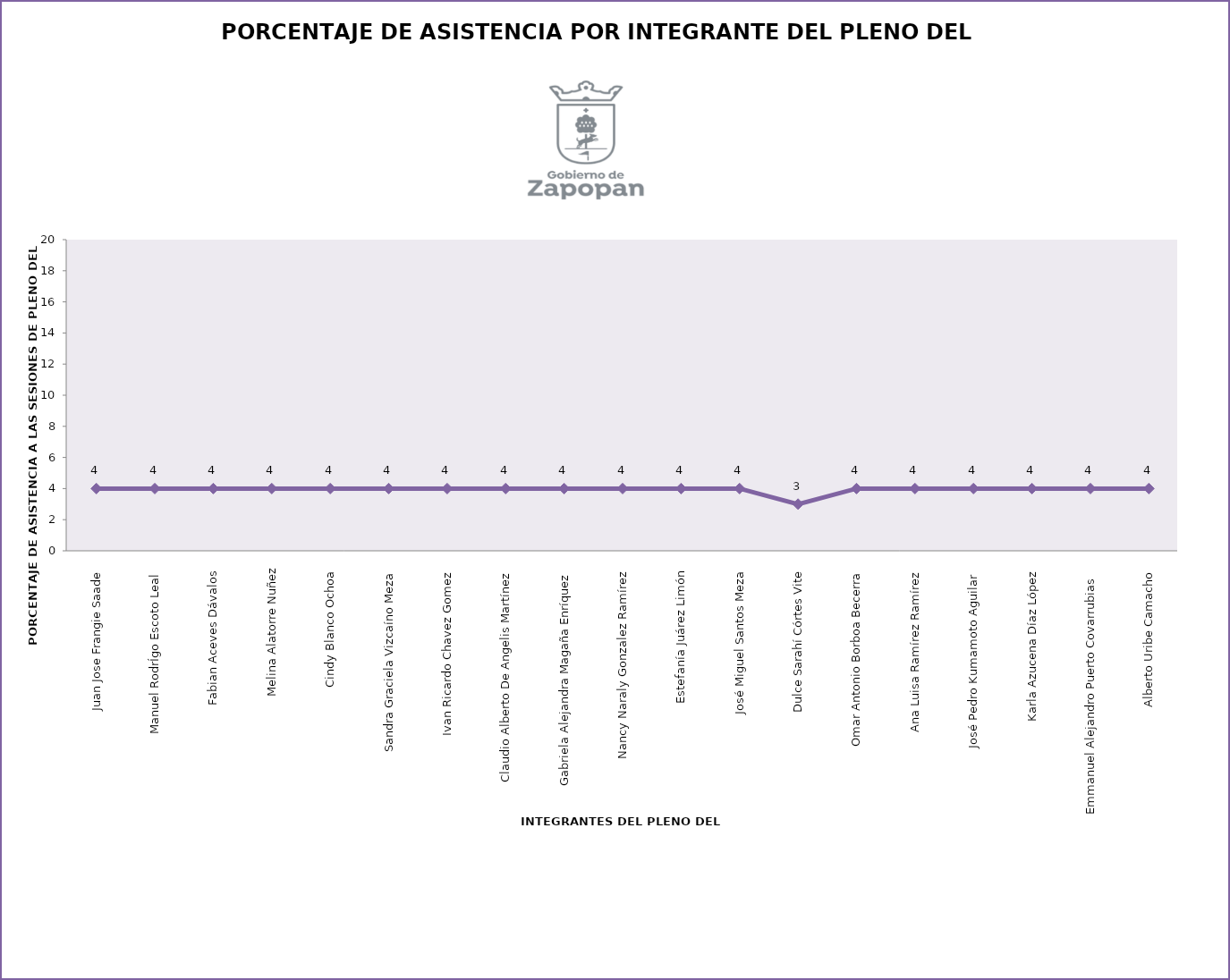
| Category | Series 0 |
|---|---|
| Juan Jose Frangie Saade  | 4 |
| Manuel RodrÍgo Escoto Leal  | 4 |
| Fabian Aceves Dávalos  | 4 |
| Melina Alatorre Nuñez | 4 |
| Cindy Blanco Ochoa  | 4 |
| Sandra Graciela Vizcaíno Meza  | 4 |
| Ivan Ricardo Chavez Gomez  | 4 |
| Claudio Alberto De Angelis Martínez  | 4 |
| Gabriela Alejandra Magaña Enríquez  | 4 |
| Nancy Naraly Gonzalez Ramírez  | 4 |
| Estefanía Juárez Limón  | 4 |
| José Miguel Santos Meza  | 4 |
| Dulce Sarahí Córtes Vite  | 3 |
| Omar Antonio Borboa Becerra  | 4 |
| Ana Luisa Ramírez Ramírez  | 4 |
| José Pedro Kumamoto Aguilar   | 4 |
| Karla Azucena Díaz López  | 4 |
| Emmanuel Alejandro Puerto Covarrubias   | 4 |
| Alberto Uribe Camacho  | 4 |